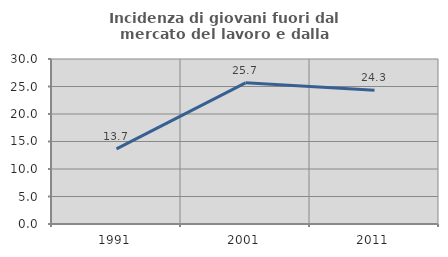
| Category | Incidenza di giovani fuori dal mercato del lavoro e dalla formazione  |
|---|---|
| 1991.0 | 13.669 |
| 2001.0 | 25.664 |
| 2011.0 | 24.315 |